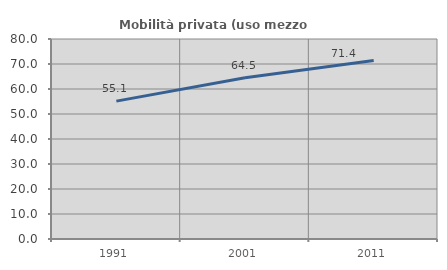
| Category | Mobilità privata (uso mezzo privato) |
|---|---|
| 1991.0 | 55.144 |
| 2001.0 | 64.528 |
| 2011.0 | 71.376 |